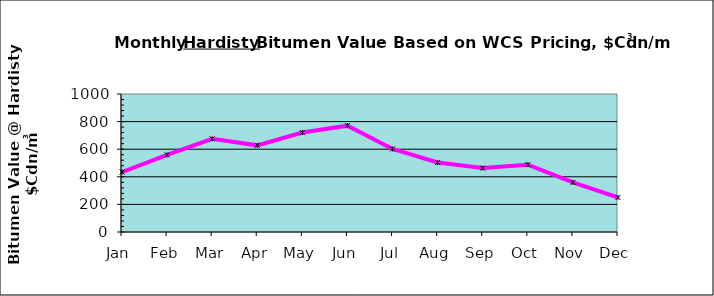
| Category |  Bitumen @ Hardisty |
|---|---|
| Jan | 434.1 |
| Feb | 558.32 |
| Mar | 675.41 |
| Apr | 627.92 |
| May | 720.49 |
| Jun | 770.64 |
| Jul | 601.91 |
| Aug | 503.37 |
| Sep | 463.17 |
| Oct | 487.93 |
| Nov | 359.7 |
| Dec | 250.46 |